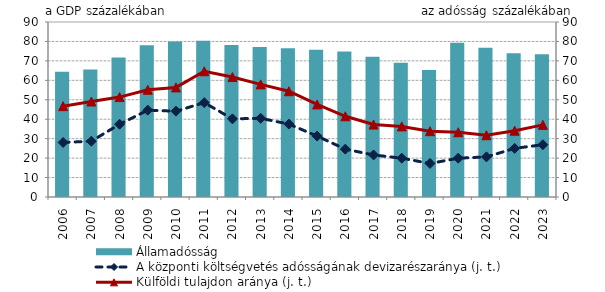
| Category | Államadósság |
|---|---|
| 2006.0 | 64.407 |
| 2007.0 | 65.531 |
| 2008.0 | 71.735 |
| 2009.0 | 78.005 |
| 2010.0 | 79.973 |
| 2011.0 | 80.306 |
| 2012.0 | 78.129 |
| 2013.0 | 77.171 |
| 2014.0 | 76.517 |
| 2015.0 | 75.739 |
| 2016.0 | 74.835 |
| 2017.0 | 72.114 |
| 2018.0 | 69.078 |
| 2019.0 | 65.346 |
| 2020.0 | 79.276 |
| 2021.0 | 76.771 |
| 2022.0 | 73.992 |
| 2023.0 | 73.403 |